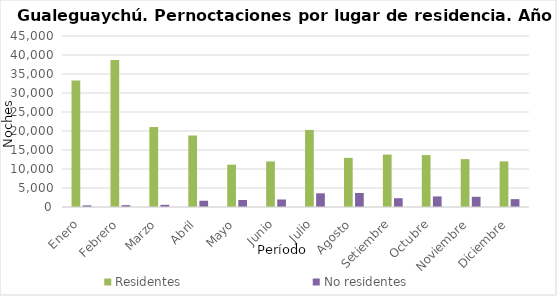
| Category | Residentes | No residentes |
|---|---|---|
| Enero | 33272 | 435 |
| Febrero | 38716 | 486 |
| Marzo | 21043 | 571 |
| Abril | 18814 | 1649 |
| Mayo | 11144 | 1849 |
| Junio | 12000 | 1975 |
| Julio | 20283 | 3599 |
| Agosto | 12940 | 3688 |
| Setiembre | 13805 | 2313 |
| Octubre | 13655 | 2782 |
| Noviembre | 12604 | 2687 |
| Diciembre | 12013 | 2068 |